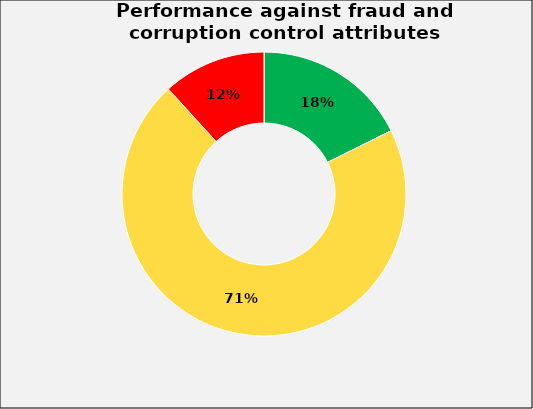
| Category | Series 0 |
|---|---|
| 0 | 3 |
| 1 | 12 |
| 2 | 2 |